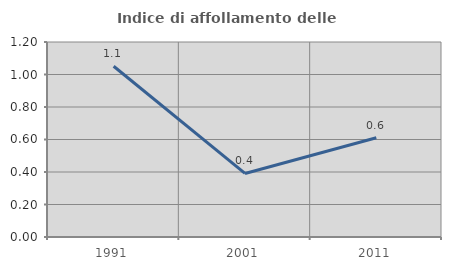
| Category | Indice di affollamento delle abitazioni  |
|---|---|
| 1991.0 | 1.051 |
| 2001.0 | 0.391 |
| 2011.0 | 0.611 |